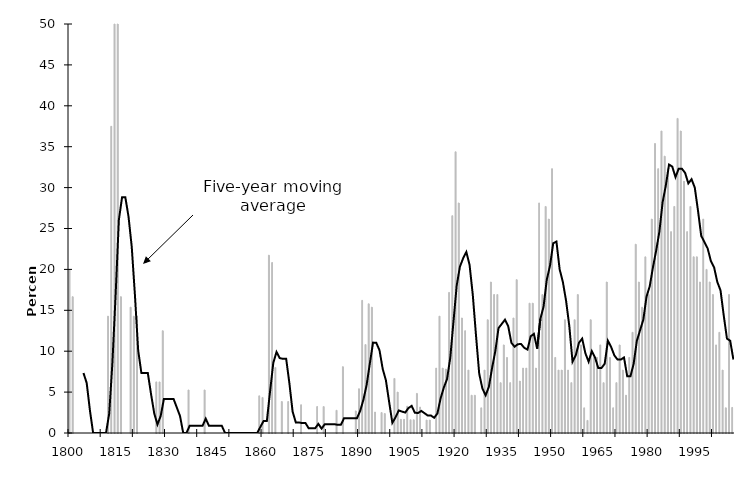
| Category | Series 1 |
|---|---|
| 1800.0 | 20 |
| 1801.0 | 16.667 |
| 1802.0 | 0 |
| 1803.0 | 0 |
| 1804.0 | 0 |
| 1805.0 | 0 |
| 1806.0 | 0 |
| 1807.0 | 0 |
| 1808.0 | 0 |
| 1809.0 | 0 |
| 1810.0 | 0 |
| 1811.0 | 0 |
| 1812.0 | 14.286 |
| 1813.0 | 37.5 |
| 1814.0 | 50 |
| 1815.0 | 54.545 |
| 1816.0 | 16.667 |
| 1817.0 | 0 |
| 1818.0 | 0 |
| 1819.0 | 15.385 |
| 1820.0 | 14.286 |
| 1821.0 | 14.286 |
| 1822.0 | 0 |
| 1823.0 | 0 |
| 1824.0 | 0 |
| 1825.0 | 0 |
| 1826.0 | 0 |
| 1827.0 | 6.25 |
| 1828.0 | 6.25 |
| 1829.0 | 12.5 |
| 1830.0 | 0 |
| 1831.0 | 0 |
| 1832.0 | 0 |
| 1833.0 | 0 |
| 1834.0 | 0 |
| 1835.0 | 0 |
| 1836.0 | 0 |
| 1837.0 | 5.263 |
| 1838.0 | 0 |
| 1839.0 | 0 |
| 1840.0 | 0 |
| 1841.0 | 0 |
| 1842.0 | 5.263 |
| 1843.0 | 0 |
| 1844.0 | 0 |
| 1845.0 | 0 |
| 1846.0 | 0 |
| 1847.0 | 0 |
| 1848.0 | 0 |
| 1849.0 | 0 |
| 1850.0 | 0 |
| 1851.0 | 0 |
| 1852.0 | 0 |
| 1853.0 | 0 |
| 1854.0 | 0 |
| 1855.0 | 0 |
| 1856.0 | 0 |
| 1857.0 | 0 |
| 1858.0 | 0 |
| 1859.0 | 4.545 |
| 1860.0 | 4.348 |
| 1861.0 | 0 |
| 1862.0 | 21.739 |
| 1863.0 | 20.833 |
| 1864.0 | 8 |
| 1865.0 | 0 |
| 1866.0 | 3.846 |
| 1867.0 | 0 |
| 1868.0 | 3.846 |
| 1869.0 | 0 |
| 1870.0 | 0 |
| 1871.0 | 0 |
| 1872.0 | 3.448 |
| 1873.0 | 0 |
| 1874.0 | 0 |
| 1875.0 | 0 |
| 1876.0 | 0 |
| 1877.0 | 3.226 |
| 1878.0 | 0 |
| 1879.0 | 3.226 |
| 1880.0 | 0 |
| 1881.0 | 0 |
| 1882.0 | 0 |
| 1883.0 | 2.778 |
| 1884.0 | 0 |
| 1885.0 | 8.108 |
| 1886.0 | 0 |
| 1887.0 | 0 |
| 1888.0 | 0 |
| 1889.0 | 2.703 |
| 1890.0 | 5.405 |
| 1891.0 | 16.216 |
| 1892.0 | 10.811 |
| 1893.0 | 15.789 |
| 1894.0 | 15.385 |
| 1895.0 | 2.564 |
| 1896.0 | 0 |
| 1897.0 | 2.5 |
| 1898.0 | 2.381 |
| 1899.0 | 0 |
| 1900.0 | 0 |
| 1901.0 | 6.667 |
| 1902.0 | 5 |
| 1903.0 | 1.667 |
| 1904.0 | 1.667 |
| 1905.0 | 3.279 |
| 1906.0 | 1.613 |
| 1907.0 | 1.613 |
| 1908.0 | 4.839 |
| 1909.0 | 3.175 |
| 1910.0 | 0 |
| 1911.0 | 1.587 |
| 1912.0 | 1.587 |
| 1913.0 | 0 |
| 1914.0 | 7.937 |
| 1915.0 | 14.286 |
| 1916.0 | 7.937 |
| 1917.0 | 7.812 |
| 1918.0 | 17.188 |
| 1919.0 | 26.562 |
| 1920.0 | 34.375 |
| 1921.0 | 28.125 |
| 1922.0 | 14.062 |
| 1923.0 | 12.5 |
| 1924.0 | 7.692 |
| 1925.0 | 4.615 |
| 1926.0 | 4.615 |
| 1927.0 | 0 |
| 1928.0 | 3.077 |
| 1929.0 | 7.692 |
| 1930.0 | 13.846 |
| 1931.0 | 18.462 |
| 1932.0 | 16.923 |
| 1933.0 | 16.923 |
| 1934.0 | 6.154 |
| 1935.0 | 10.769 |
| 1936.0 | 9.231 |
| 1937.0 | 6.154 |
| 1938.0 | 14.062 |
| 1939.0 | 18.75 |
| 1940.0 | 6.349 |
| 1941.0 | 7.937 |
| 1942.0 | 7.937 |
| 1943.0 | 15.873 |
| 1944.0 | 15.873 |
| 1945.0 | 7.937 |
| 1946.0 | 28.125 |
| 1947.0 | 16.923 |
| 1948.0 | 27.692 |
| 1949.0 | 26.154 |
| 1950.0 | 32.308 |
| 1951.0 | 9.231 |
| 1952.0 | 7.692 |
| 1953.0 | 7.692 |
| 1954.0 | 13.846 |
| 1955.0 | 7.692 |
| 1956.0 | 6.154 |
| 1957.0 | 13.846 |
| 1958.0 | 16.923 |
| 1959.0 | 10.769 |
| 1960.0 | 3.077 |
| 1961.0 | 1.538 |
| 1962.0 | 13.846 |
| 1963.0 | 9.231 |
| 1964.0 | 9.231 |
| 1965.0 | 10.769 |
| 1966.0 | 6.154 |
| 1967.0 | 18.462 |
| 1968.0 | 9.231 |
| 1969.0 | 3.077 |
| 1970.0 | 6.154 |
| 1971.0 | 10.769 |
| 1972.0 | 7.692 |
| 1973.0 | 4.615 |
| 1974.0 | 9.231 |
| 1975.0 | 12.308 |
| 1976.0 | 23.077 |
| 1977.0 | 18.462 |
| 1978.0 | 15.385 |
| 1979.0 | 21.538 |
| 1980.0 | 16.923 |
| 1981.0 | 26.154 |
| 1982.0 | 35.385 |
| 1983.0 | 32.308 |
| 1984.0 | 36.923 |
| 1985.0 | 33.846 |
| 1986.0 | 32.308 |
| 1987.0 | 24.615 |
| 1988.0 | 27.692 |
| 1989.0 | 38.462 |
| 1990.0 | 36.923 |
| 1991.0 | 30.769 |
| 1992.0 | 24.615 |
| 1993.0 | 27.692 |
| 1994.0 | 21.538 |
| 1995.0 | 21.538 |
| 1996.0 | 18.462 |
| 1997.0 | 26.154 |
| 1998.0 | 20 |
| 1999.0 | 18.462 |
| 2000.0 | 16.923 |
| 2001.0 | 10.769 |
| 2002.0 | 12.308 |
| 2003.0 | 7.692 |
| 2004.0 | 3.077 |
| 2005.0 | 16.923 |
| 2006.0 | 3.125 |